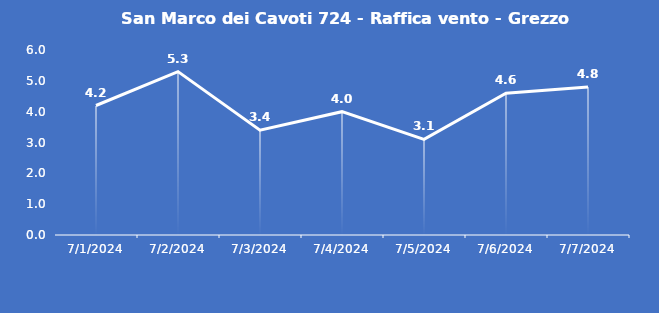
| Category | San Marco dei Cavoti 724 - Raffica vento - Grezzo (m/s) |
|---|---|
| 7/1/24 | 4.2 |
| 7/2/24 | 5.3 |
| 7/3/24 | 3.4 |
| 7/4/24 | 4 |
| 7/5/24 | 3.1 |
| 7/6/24 | 4.6 |
| 7/7/24 | 4.8 |